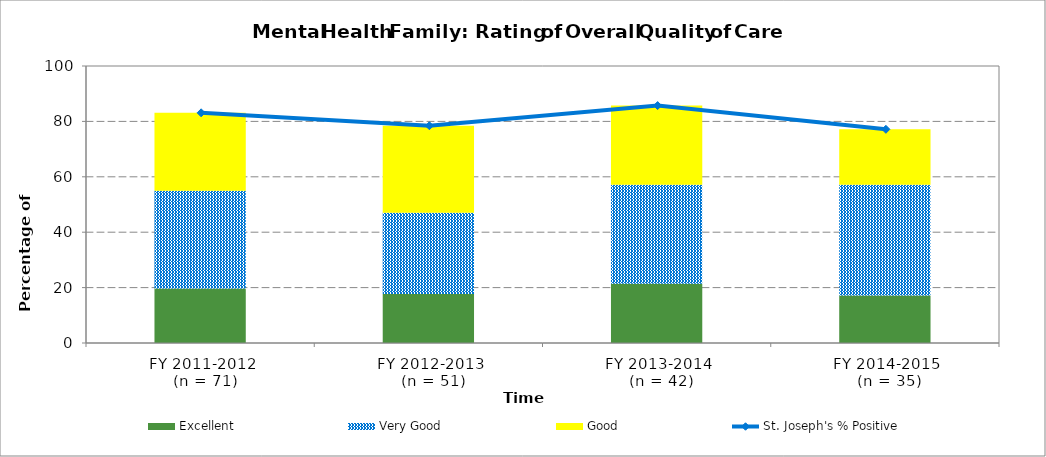
| Category | Excellent | Very Good | Good |
|---|---|---|---|
| FY 2011-2012
 (n = 71) | 19.72 | 35.21 | 28.17 |
| FY 2012-2013
 (n = 51) | 17.65 | 29.41 | 31.37 |
| FY 2013-2014
 (n = 42) | 21.43 | 35.71 | 28.57 |
| FY 2014-2015
 (n = 35) | 17.14 | 40 | 20 |